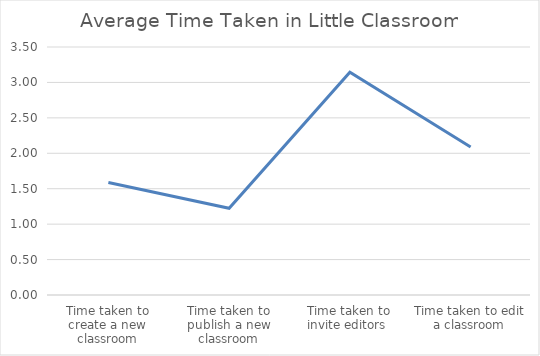
| Category | Series 0 |
|---|---|
| Time taken to create a new classroom | 1.588 |
| Time taken to publish a new classroom | 1.223 |
| Time taken to invite editors  | 3.145 |
| Time taken to edit a classroom | 2.09 |